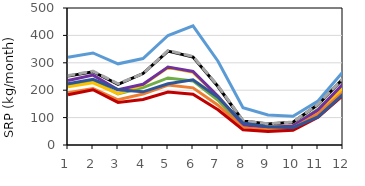
| Category | Baseline | GW | CBS | WASCOB | NRW | FP | GW + CBS | GW + CBS + WASCOB | All ACPs |
|---|---|---|---|---|---|---|---|---|---|
| 1.0 | 251.338 | 217 | 212.123 | 235.133 | 320.379 | 253.221 | 190.613 | 183.092 | 223.331 |
| 2.0 | 267.38 | 233.911 | 226.777 | 255.121 | 335.849 | 269.49 | 206.291 | 201.542 | 239.519 |
| 3.0 | 221.489 | 186.358 | 187.262 | 201.604 | 296.207 | 223.534 | 164.984 | 155.577 | 201.656 |
| 4.0 | 260.641 | 209.342 | 219.084 | 221.393 | 315.539 | 260.221 | 185.859 | 166.164 | 194.047 |
| 5.0 | 342.803 | 244.747 | 283.139 | 284.233 | 399.616 | 344.904 | 219.019 | 193.579 | 223.539 |
| 6.0 | 321.117 | 233.983 | 265.066 | 268.227 | 434.766 | 323.205 | 208.54 | 184.98 | 238.297 |
| 7.0 | 213.348 | 163.504 | 176.92 | 178.096 | 305.928 | 215.46 | 145.432 | 128.797 | 173.993 |
| 8.0 | 87.622 | 69.632 | 73.942 | 73.389 | 136.157 | 88.736 | 62.347 | 55.417 | 80.368 |
| 9.0 | 76.53 | 62.982 | 64.408 | 63.846 | 109.508 | 77.446 | 55.918 | 49.408 | 66.155 |
| 10.0 | 82.712 | 70.336 | 69.282 | 69.804 | 104.699 | 83.714 | 61.523 | 54.19 | 62.961 |
| 11.0 | 147.564 | 130.229 | 124.407 | 127.317 | 160.303 | 148.347 | 113.525 | 101.238 | 102.284 |
| 12.0 | 241.929 | 219.881 | 206.45 | 222.732 | 267.242 | 242.912 | 192.699 | 181.311 | 185.105 |